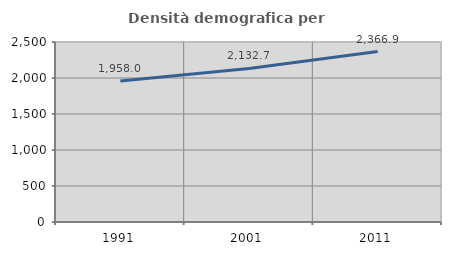
| Category | Densità demografica |
|---|---|
| 1991.0 | 1958.018 |
| 2001.0 | 2132.657 |
| 2011.0 | 2366.942 |